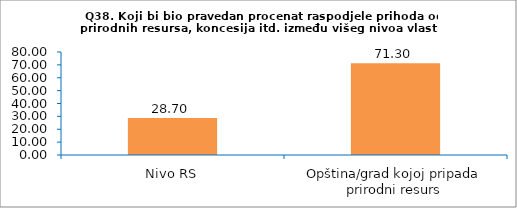
| Category | Series 0 |
|---|---|
| Nivo RS | 28.698 |
| Opština/grad kojoj pripada prirodni resurs | 71.302 |